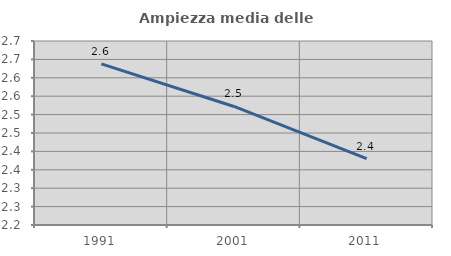
| Category | Ampiezza media delle famiglie |
|---|---|
| 1991.0 | 2.638 |
| 2001.0 | 2.522 |
| 2011.0 | 2.38 |